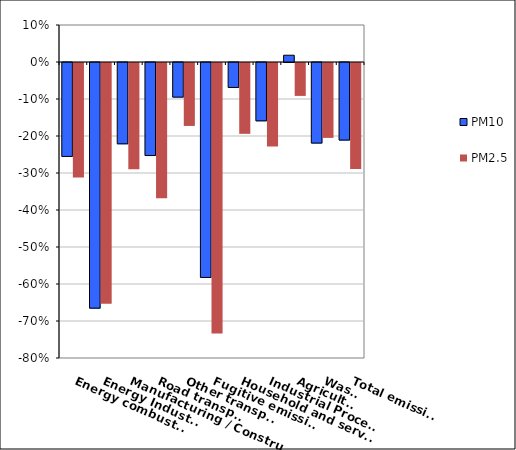
| Category | PM10 | PM2.5 |
|---|---|---|
| Energy combustion | -0.254 | -0.309 |
| Energy Industries | -0.664 | -0.651 |
| Manufacturing / Construction | -0.22 | -0.287 |
| Road transport | -0.251 | -0.366 |
| Other transport | -0.094 | -0.17 |
| Fugitive emissions | -0.581 | -0.731 |
| Household and services | -0.067 | -0.191 |
| Industrial Processes | -0.158 | -0.226 |
| Agriculture | 0.018 | -0.089 |
| Waste | -0.218 | -0.202 |
| Total emissions | -0.21 | -0.286 |